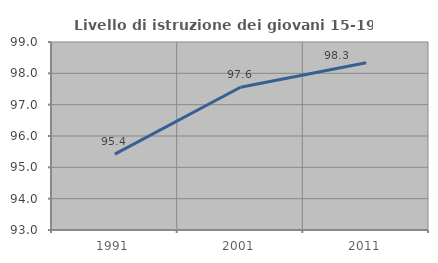
| Category | Livello di istruzione dei giovani 15-19 anni |
|---|---|
| 1991.0 | 95.423 |
| 2001.0 | 97.556 |
| 2011.0 | 98.337 |